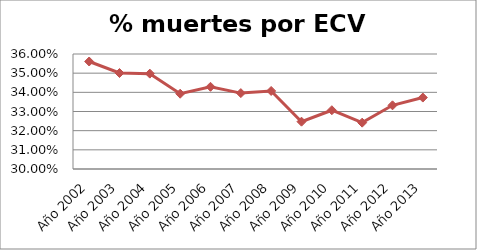
| Category | Series 0 |
|---|---|
| Año 2002 | 0.356 |
| Año 2003 | 0.35 |
| Año 2004 | 0.35 |
| Año 2005 | 0.339 |
| Año 2006 | 0.343 |
| Año 2007 | 0.34 |
| Año 2008 | 0.341 |
| Año 2009 | 0.325 |
| Año 2010 | 0.331 |
| Año 2011 | 0.324 |
| Año 2012 | 0.333 |
| Año 2013 | 0.337 |